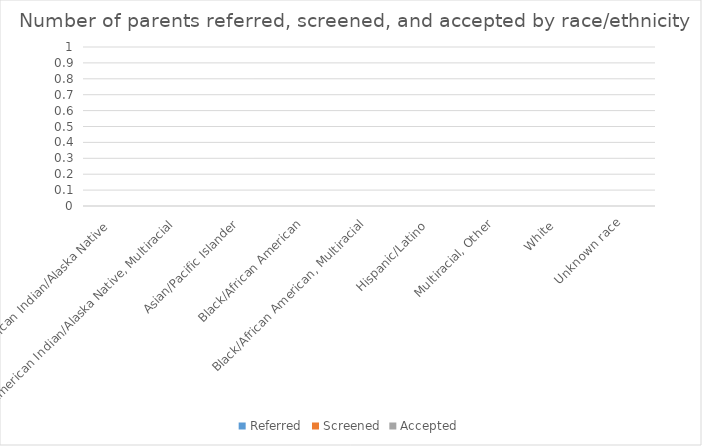
| Category | Referred | Screened | Accepted |
|---|---|---|---|
| American Indian/Alaska Native  | 0 | 0 | 0 |
| American Indian/Alaska Native, Multiracial | 0 | 0 | 0 |
| Asian/Pacific Islander | 0 | 0 | 0 |
| Black/African American | 0 | 0 | 0 |
| Black/African American, Multiracial | 0 | 0 | 0 |
| Hispanic/Latino  | 0 | 0 | 0 |
| Multiracial, Other | 0 | 0 | 0 |
| White  | 0 | 0 | 0 |
| Unknown race | 0 | 0 | 0 |